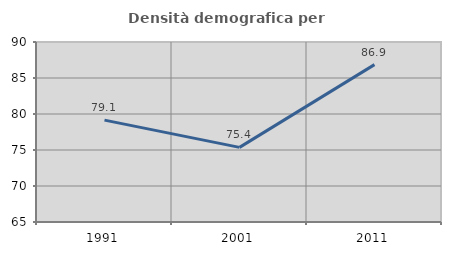
| Category | Densità demografica |
|---|---|
| 1991.0 | 79.149 |
| 2001.0 | 75.367 |
| 2011.0 | 86.854 |